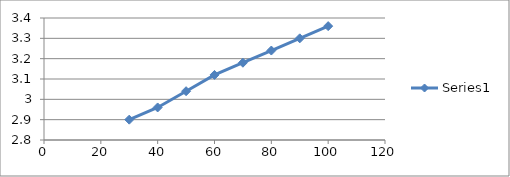
| Category | Series 0 |
|---|---|
| 100.0 | 3.36 |
| 90.0 | 3.3 |
| 80.0 | 3.24 |
| 70.0 | 3.18 |
| 60.0 | 3.12 |
| 50.0 | 3.04 |
| 40.0 | 2.96 |
| 30.0 | 2.9 |